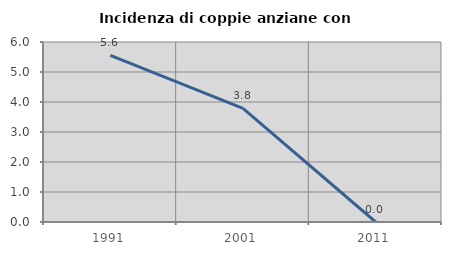
| Category | Incidenza di coppie anziane con figli |
|---|---|
| 1991.0 | 5.556 |
| 2001.0 | 3.788 |
| 2011.0 | 0 |